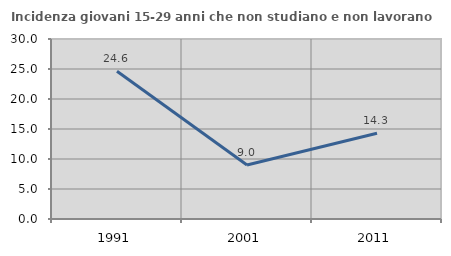
| Category | Incidenza giovani 15-29 anni che non studiano e non lavorano  |
|---|---|
| 1991.0 | 24.615 |
| 2001.0 | 9.013 |
| 2011.0 | 14.286 |